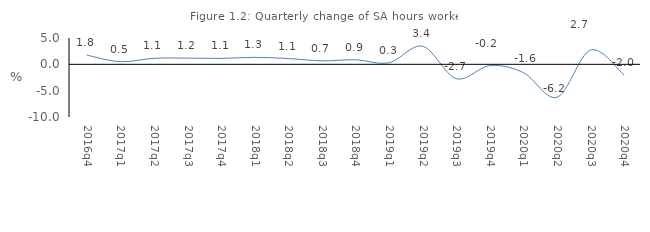
| Category | Series 0 |
|---|---|
| 2016q4 | 1.752 |
| 2017q1 | 0.496 |
| 2017q2 | 1.145 |
| 2017q3 | 1.182 |
| 2017q4 | 1.125 |
| 2018q1 | 1.322 |
| 2018q2 | 1.099 |
| 2018q3 | 0.658 |
| 2018q4 | 0.869 |
| 2019q1 | 0.306 |
| 2019q2 | 3.428 |
| 2019q3 | -2.732 |
| 2019q4 | -0.237 |
| 2020q1 | -1.585 |
| 2020q2 | -6.246 |
| 2020q3 | 2.728 |
| 2020q4 | -2.041 |